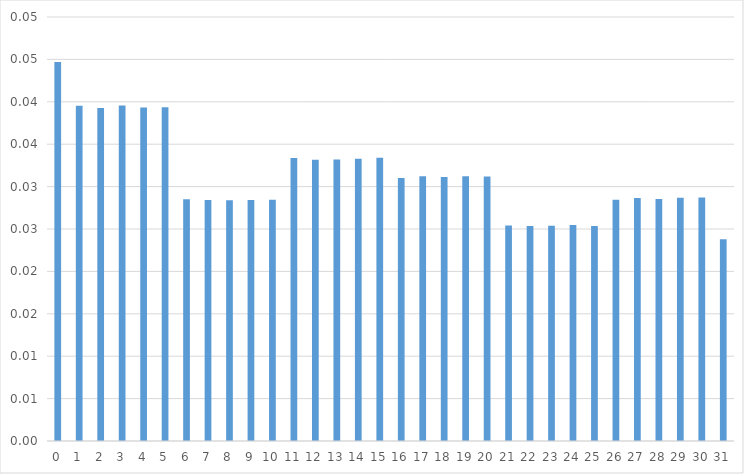
| Category | Series 0 |
|---|---|
| 0.0 | 0.045 |
| 1.0 | 0.04 |
| 2.0 | 0.039 |
| 3.0 | 0.04 |
| 4.0 | 0.039 |
| 5.0 | 0.039 |
| 6.0 | 0.029 |
| 7.0 | 0.028 |
| 8.0 | 0.028 |
| 9.0 | 0.028 |
| 10.0 | 0.028 |
| 11.0 | 0.033 |
| 12.0 | 0.033 |
| 13.0 | 0.033 |
| 14.0 | 0.033 |
| 15.0 | 0.033 |
| 16.0 | 0.031 |
| 17.0 | 0.031 |
| 18.0 | 0.031 |
| 19.0 | 0.031 |
| 20.0 | 0.031 |
| 21.0 | 0.025 |
| 22.0 | 0.025 |
| 23.0 | 0.025 |
| 24.0 | 0.025 |
| 25.0 | 0.025 |
| 26.0 | 0.028 |
| 27.0 | 0.029 |
| 28.0 | 0.029 |
| 29.0 | 0.029 |
| 30.0 | 0.029 |
| 31.0 | 0.024 |